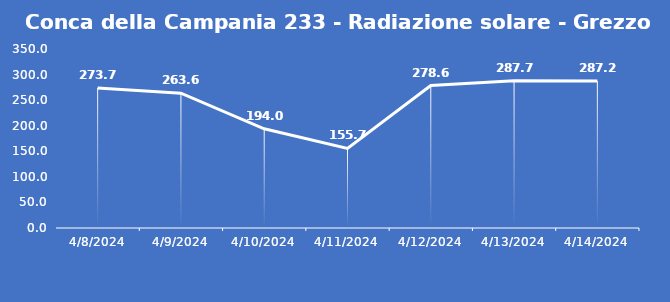
| Category | Conca della Campania 233 - Radiazione solare - Grezzo (W/m2) |
|---|---|
| 4/8/24 | 273.7 |
| 4/9/24 | 263.6 |
| 4/10/24 | 194 |
| 4/11/24 | 155.7 |
| 4/12/24 | 278.6 |
| 4/13/24 | 287.7 |
| 4/14/24 | 287.2 |